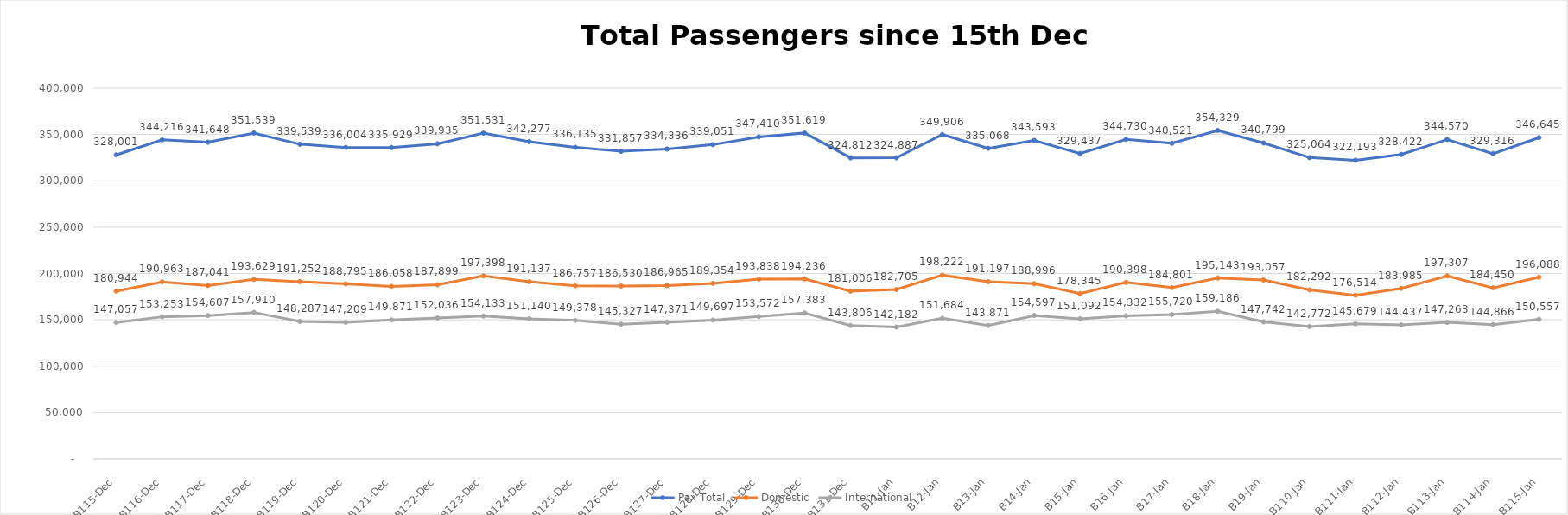
| Category | Pax Total |  Domestic  |  International  |
|---|---|---|---|
| 2022-12-15 | 328001 | 180944 | 147057 |
| 2022-12-16 | 344216 | 190963 | 153253 |
| 2022-12-17 | 341648 | 187041 | 154607 |
| 2022-12-18 | 351539 | 193629 | 157910 |
| 2022-12-19 | 339539 | 191252 | 148287 |
| 2022-12-20 | 336004 | 188795 | 147209 |
| 2022-12-21 | 335929 | 186058 | 149871 |
| 2022-12-22 | 339935 | 187899 | 152036 |
| 2022-12-23 | 351531 | 197398 | 154133 |
| 2022-12-24 | 342277 | 191137 | 151140 |
| 2022-12-25 | 336135 | 186757 | 149378 |
| 2022-12-26 | 331857 | 186530 | 145327 |
| 2022-12-27 | 334336 | 186965 | 147371 |
| 2022-12-28 | 339051 | 189354 | 149697 |
| 2022-12-29 | 347410 | 193838 | 153572 |
| 2022-12-30 | 351619 | 194236 | 157383 |
| 2022-12-31 | 324812 | 181006 | 143806 |
| 2023-01-01 | 324887 | 182705 | 142182 |
| 2023-01-02 | 349906 | 198222 | 151684 |
| 2023-01-03 | 335068 | 191197 | 143871 |
| 2023-01-04 | 343593 | 188996 | 154597 |
| 2023-01-05 | 329437 | 178345 | 151092 |
| 2023-01-06 | 344730 | 190398 | 154332 |
| 2023-01-07 | 340521 | 184801 | 155720 |
| 2023-01-08 | 354329 | 195143 | 159186 |
| 2023-01-09 | 340799 | 193057 | 147742 |
| 2023-01-10 | 325064 | 182292 | 142772 |
| 2023-01-11 | 322193 | 176514 | 145679 |
| 2023-01-12 | 328422 | 183985 | 144437 |
| 2023-01-13 | 344570 | 197307 | 147263 |
| 2023-01-14 | 329316 | 184450 | 144866 |
| 2023-01-15 | 346645 | 196088 | 150557 |